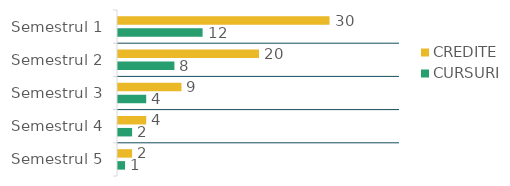
| Category | CREDITE  | CURSURI  |
|---|---|---|
| Semestrul 1 | 30 | 12 |
| Semestrul 2 | 20 | 8 |
| Semestrul 3 | 9 | 4 |
| Semestrul 4 | 4 | 2 |
| Semestrul 5 | 2 | 1 |